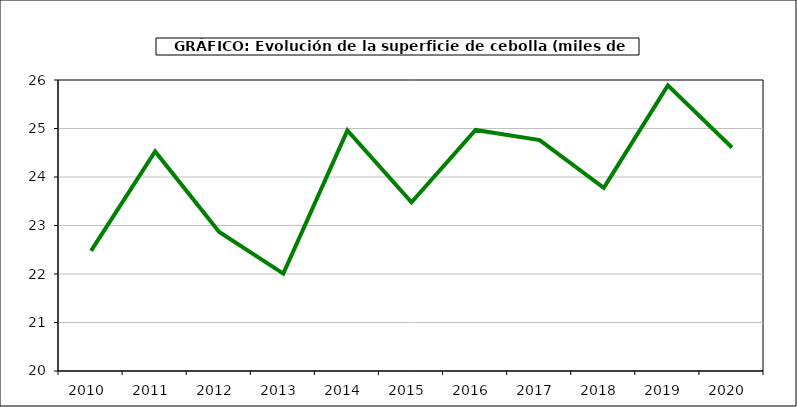
| Category | superficie |
|---|---|
| 2010.0 | 22.478 |
| 2011.0 | 24.526 |
| 2012.0 | 22.867 |
| 2013.0 | 22.008 |
| 2014.0 | 24.961 |
| 2015.0 | 23.48 |
| 2016.0 | 24.969 |
| 2017.0 | 24.762 |
| 2018.0 | 23.775 |
| 2019.0 | 25.889 |
| 2020.0 | 24.608 |